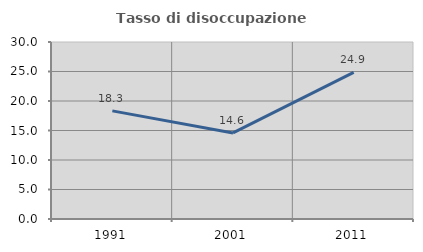
| Category | Tasso di disoccupazione giovanile  |
|---|---|
| 1991.0 | 18.325 |
| 2001.0 | 14.583 |
| 2011.0 | 24.862 |